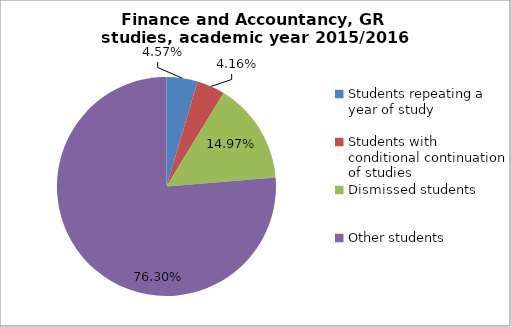
| Category | Series 0 |
|---|---|
| Students repeating a year of study | 22 |
| Students with conditional continuation of studies | 20 |
| Dismissed students | 72 |
| Other students | 367 |